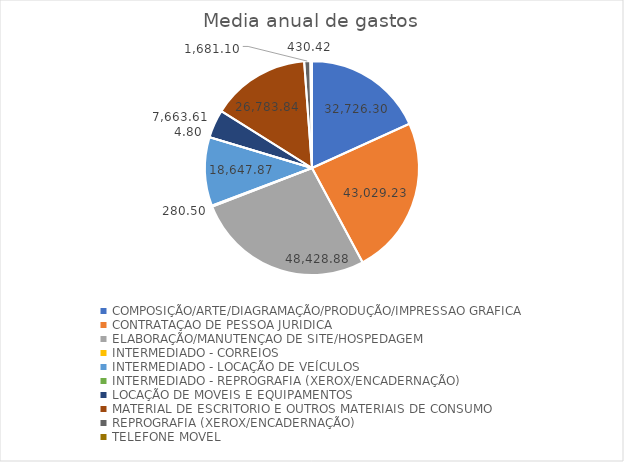
| Category | Series 0 |
|---|---|
| COMPOSIÇÃO/ARTE/DIAGRAMAÇÃO/PRODUÇÃO/IMPRESSAO GRAFICA | 32726.297 |
| CONTRATAÇAO DE PESSOA JURIDICA | 43029.23 |
| ELABORAÇÃO/MANUTENÇAO DE SITE/HOSPEDAGEM | 48428.877 |
| INTERMEDIADO - CORREIOS | 280.5 |
| INTERMEDIADO - LOCAÇÃO DE VEÍCULOS | 18647.87 |
| INTERMEDIADO - REPROGRAFIA (XEROX/ENCADERNAÇÃO) | 4.8 |
| LOCAÇÃO DE MOVEIS E EQUIPAMENTOS | 7663.61 |
| MATERIAL DE ESCRITORIO E OUTROS MATERIAIS DE CONSUMO | 26783.837 |
| REPROGRAFIA (XEROX/ENCADERNAÇÃO) | 1681.1 |
| TELEFONE MOVEL | 430.423 |